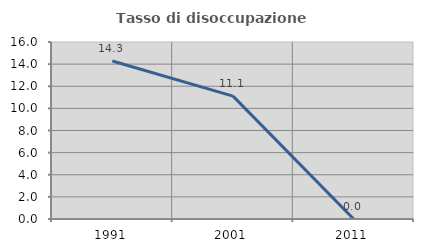
| Category | Tasso di disoccupazione giovanile  |
|---|---|
| 1991.0 | 14.286 |
| 2001.0 | 11.111 |
| 2011.0 | 0 |